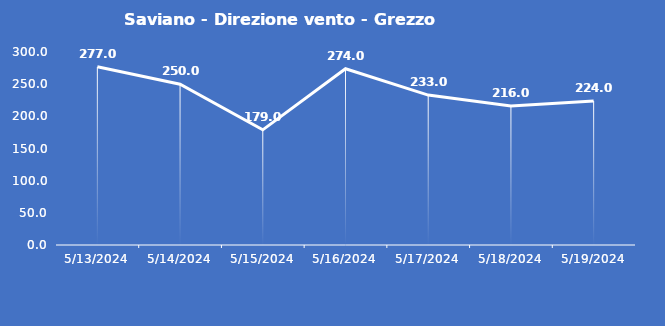
| Category | Saviano - Direzione vento - Grezzo (°N) |
|---|---|
| 5/13/24 | 277 |
| 5/14/24 | 250 |
| 5/15/24 | 179 |
| 5/16/24 | 274 |
| 5/17/24 | 233 |
| 5/18/24 | 216 |
| 5/19/24 | 224 |